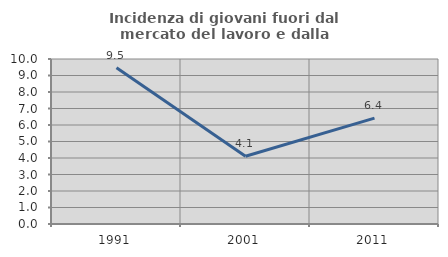
| Category | Incidenza di giovani fuori dal mercato del lavoro e dalla formazione  |
|---|---|
| 1991.0 | 9.47 |
| 2001.0 | 4.11 |
| 2011.0 | 6.415 |